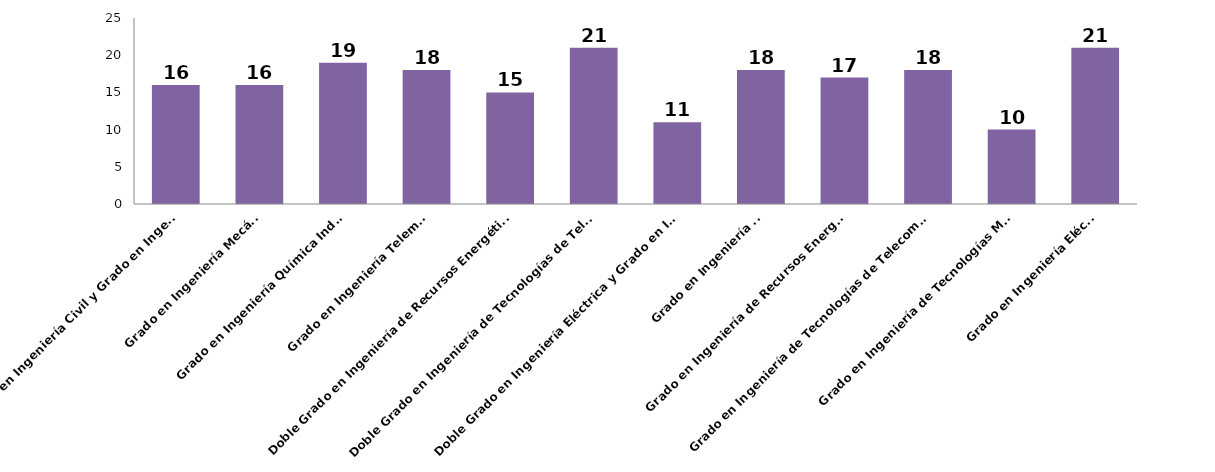
| Category | Series 0 |
|---|---|
| Doble Grado en Ingeniería Civil y Grado en Ingeniería de Tecnologías Mineras | 16 |
| Grado en Ingeniería Mecánica | 16 |
| Grado en Ingeniería Química Industrial | 19 |
| Grado en Ingeniería Telemática | 18 |
| Doble Grado en Ingeniería de Recursos Energéticos y Grado en Ingeniería Química Industrial | 15 |
| Doble Grado en Ingeniería de Tecnologías de Telecomunicación y Grado en Ingeniería Telemática | 21 |
| Doble Grado en Ingeniería Eléctrica y Grado en Ingeniería Mecánica | 11 |
| Grado en Ingeniería Civil | 18 |
| Grado en Ingeniería de Recursos Energéticos | 17 |
| Grado en Ingeniería de Tecnologías de Telecomunicación | 18 |
| Grado en Ingeniería de Tecnologías Mineras | 10 |
| Grado en Ingeniería Eléctrica | 21 |